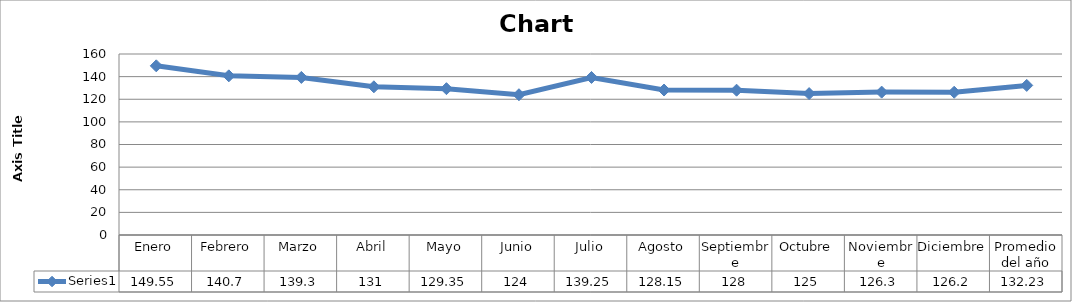
| Category | Series 0 |
|---|---|
| Enero | 149.55 |
| Febrero | 140.7 |
| Marzo | 139.3 |
| Abril | 131 |
| Mayo | 129.35 |
| Junio | 124 |
| Julio | 139.25 |
| Agosto | 128.15 |
| Septiembre | 128 |
| Octubre | 125 |
| Noviembre | 126.3 |
| Diciembre | 126.2 |
| Promedio del año | 132.233 |